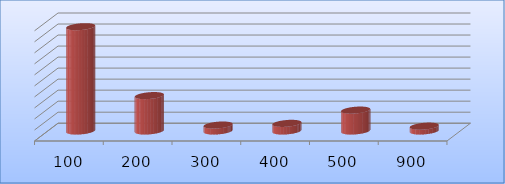
| Category | Series 0 |
|---|---|
| 100.0 | 47324657 |
| 200.0 | 16063328 |
| 300.0 | 2704311 |
| 400.0 | 3466530 |
| 500.0 | 9480000 |
| 900.0 | 2204275 |